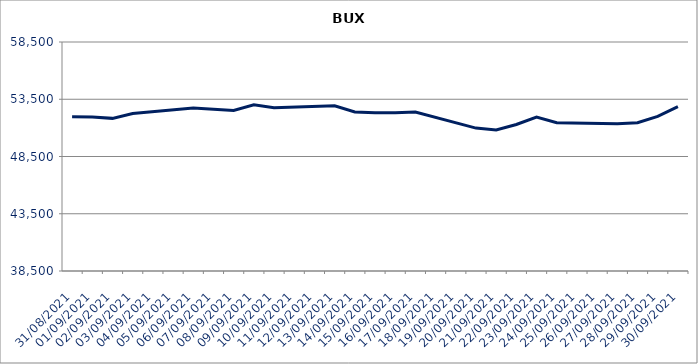
| Category | Series 0 |
|---|---|
| 31/08/2021 | 51969.67 |
| 01/09/2021 | 51946.96 |
| 02/09/2021 | 51830.24 |
| 03/09/2021 | 52255.11 |
| 06/09/2021 | 52743.09 |
| 07/09/2021 | 52623.96 |
| 08/09/2021 | 52514.94 |
| 09/09/2021 | 53015.67 |
| 10/09/2021 | 52755.68 |
| 13/09/2021 | 52922.72 |
| 14/09/2021 | 52392.39 |
| 15/09/2021 | 52317.91 |
| 16/09/2021 | 52331.31 |
| 17/09/2021 | 52376.91 |
| 20/09/2021 | 50982.15 |
| 21/09/2021 | 50815.56 |
| 22/09/2021 | 51298.14 |
| 23/09/2021 | 51946.86 |
| 24/09/2021 | 51453.71 |
| 27/09/2021 | 51365.99 |
| 28/09/2021 | 51446.2 |
| 29/09/2021 | 52004.6 |
| 30/09/2021 | 52854.65 |